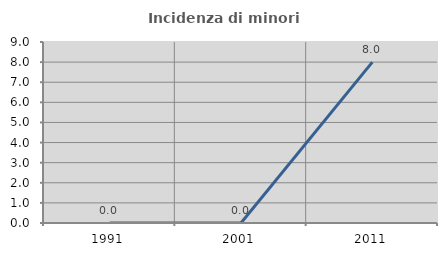
| Category | Incidenza di minori stranieri |
|---|---|
| 1991.0 | 0 |
| 2001.0 | 0 |
| 2011.0 | 8 |